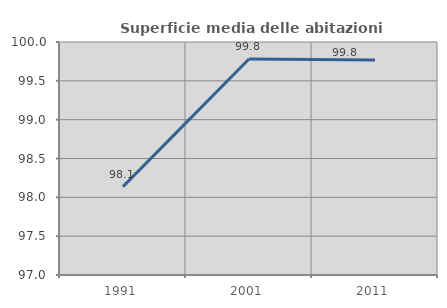
| Category | Superficie media delle abitazioni occupate |
|---|---|
| 1991.0 | 98.138 |
| 2001.0 | 99.781 |
| 2011.0 | 99.767 |